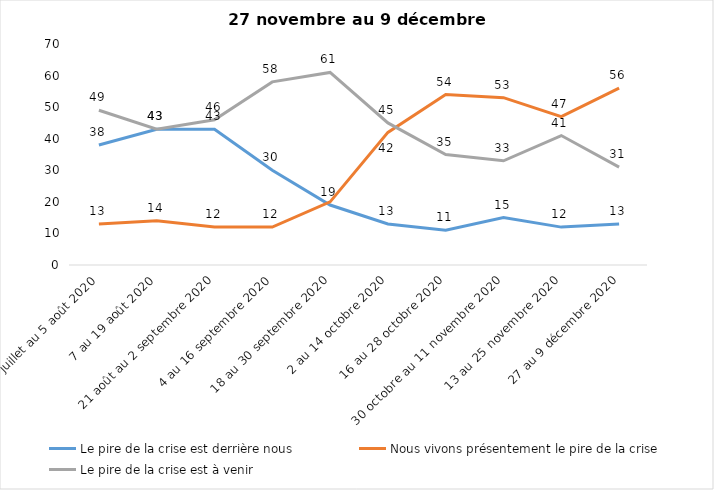
| Category | Le pire de la crise est derrière nous | Nous vivons présentement le pire de la crise | Le pire de la crise est à venir |
|---|---|---|---|
| 24 juillet au 5 août 2020 | 38 | 13 | 49 |
| 7 au 19 août 2020 | 43 | 14 | 43 |
| 21 août au 2 septembre 2020 | 43 | 12 | 46 |
| 4 au 16 septembre 2020 | 30 | 12 | 58 |
| 18 au 30 septembre 2020 | 19 | 20 | 61 |
| 2 au 14 octobre 2020 | 13 | 42 | 45 |
| 16 au 28 octobre 2020 | 11 | 54 | 35 |
| 30 octobre au 11 novembre 2020 | 15 | 53 | 33 |
| 13 au 25 novembre 2020 | 12 | 47 | 41 |
| 27 au 9 décembre 2020 | 13 | 56 | 31 |